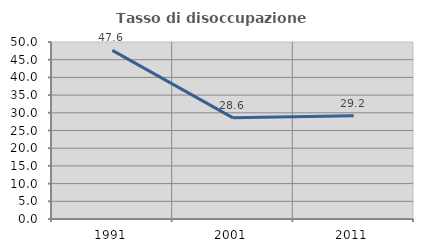
| Category | Tasso di disoccupazione giovanile  |
|---|---|
| 1991.0 | 47.619 |
| 2001.0 | 28.571 |
| 2011.0 | 29.167 |